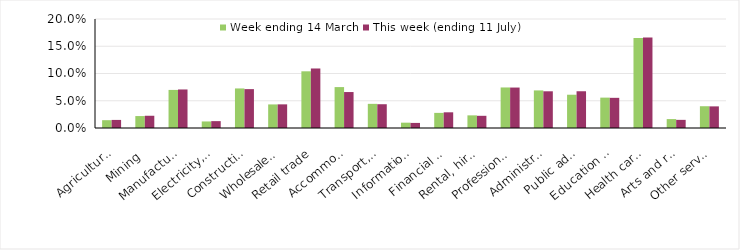
| Category | Week ending 14 March | This week (ending 11 July) |
|---|---|---|
| Agriculture, forestry and fishing | 0.014 | 0.015 |
| Mining | 0.022 | 0.022 |
| Manufacturing | 0.07 | 0.071 |
| Electricity, gas, water and waste services | 0.012 | 0.013 |
| Construction | 0.073 | 0.071 |
| Wholesale trade | 0.043 | 0.043 |
| Retail trade | 0.104 | 0.109 |
| Accommodation and food services | 0.075 | 0.066 |
| Transport, postal and warehousing | 0.044 | 0.044 |
| Information media and telecommunications | 0.01 | 0.009 |
| Financial and insurance services | 0.028 | 0.029 |
| Rental, hiring and real estate services | 0.023 | 0.022 |
| Professional, scientific and technical services | 0.074 | 0.074 |
| Administrative and support services | 0.069 | 0.067 |
| Public administration and safety | 0.061 | 0.067 |
| Education and training | 0.056 | 0.055 |
| Health care and social assistance | 0.165 | 0.166 |
| Arts and recreation services | 0.016 | 0.015 |
| Other services | 0.04 | 0.04 |